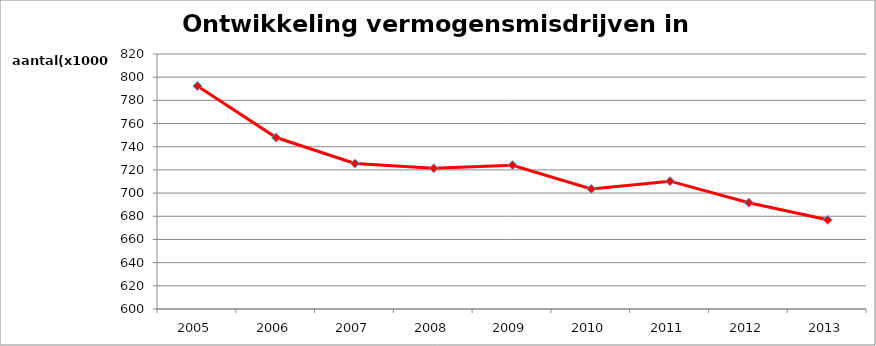
| Category | Series 0 |
|---|---|
| 2005 | 792350 |
| 2006 | 747925 |
| 2007 | 725515 |
| 2008 | 721385 |
| 2009 | 724065 |
| 2010 | 703590 |
| 2011 | 710280 |
| 2012 | 691730 |
| 2013 | 676945 |